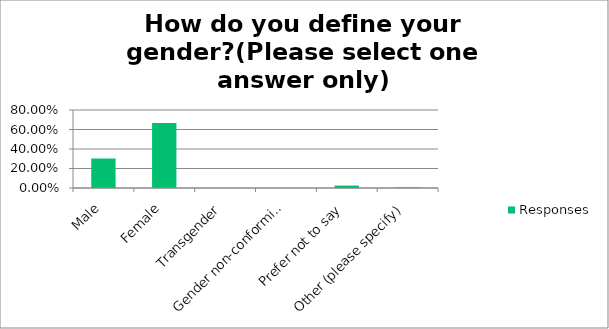
| Category | Responses |
|---|---|
| Male | 0.302 |
| Female | 0.667 |
| Transgender | 0 |
| Gender non-conforming | 0 |
| Prefer not to say | 0.025 |
| Other (please specify) | 0.006 |